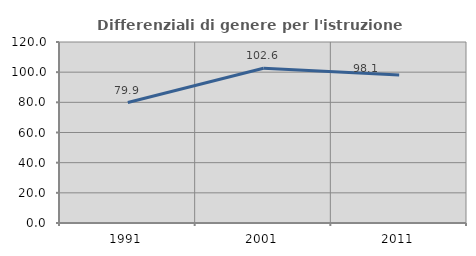
| Category | Differenziali di genere per l'istruzione superiore |
|---|---|
| 1991.0 | 79.864 |
| 2001.0 | 102.567 |
| 2011.0 | 98.089 |